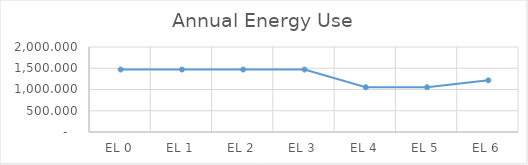
| Category | Annual Energy Use |
|---|---|
| EL 0 | 1469.293 |
| EL 1 | 1469.293 |
| EL 2 | 1469.293 |
| EL 3 | 1469.293 |
| EL 4 | 1053.193 |
| EL 5 | 1053.193 |
| EL 6 | 1215.861 |